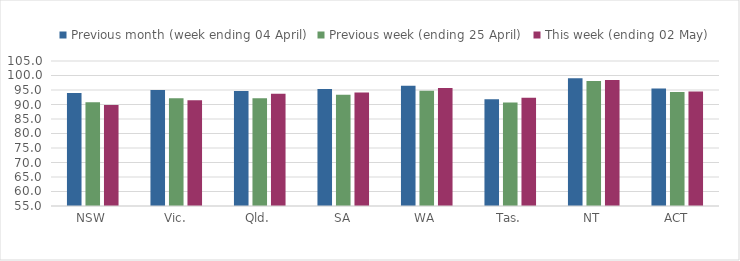
| Category | Previous month (week ending 04 April) | Previous week (ending 25 April) | This week (ending 02 May) |
|---|---|---|---|
| NSW | 93.993 | 90.78 | 89.859 |
| Vic. | 95.042 | 92.17 | 91.441 |
| Qld. | 94.683 | 92.139 | 93.676 |
| SA | 95.342 | 93.339 | 94.18 |
| WA | 96.455 | 94.77 | 95.653 |
| Tas. | 91.775 | 90.732 | 92.369 |
| NT | 99.084 | 98.093 | 98.456 |
| ACT | 95.523 | 94.291 | 94.464 |